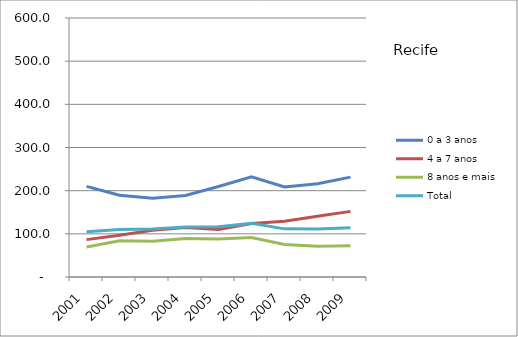
| Category | 0 a 3 anos | 4 a 7 anos | 8 anos e mais | Total |
|---|---|---|---|---|
| 2001.0 | 209.9 | 86.6 | 69.4 | 105.1 |
| 2002.0 | 189.5 | 96.8 | 84.1 | 110.2 |
| 2003.0 | 182.7 | 108.3 | 82.6 | 111.1 |
| 2004.0 | 188.8 | 114.9 | 89.3 | 115.9 |
| 2005.0 | 209.6 | 109.9 | 88 | 116.2 |
| 2006.0 | 231.9 | 123.9 | 91.3 | 124.2 |
| 2007.0 | 208.7 | 129.3 | 75.3 | 111.5 |
| 2008.0 | 216.1 | 140.5 | 71.2 | 111.1 |
| 2009.0 | 231.4 | 152 | 72.6 | 114.1 |